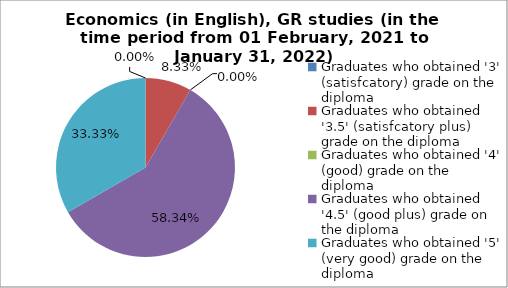
| Category | Series 0 |
|---|---|
| Graduates who obtained '3' (satisfcatory) grade on the diploma  | 0 |
| Graduates who obtained '3.5' (satisfcatory plus) grade on the diploma  | 8.333 |
| Graduates who obtained '4' (good) grade on the diploma  | 0 |
| Graduates who obtained '4.5' (good plus) grade on the diploma  | 58.333 |
| Graduates who obtained '5' (very good) grade on the diploma  | 33.333 |